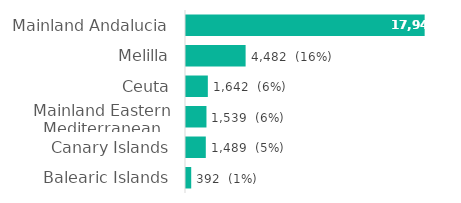
| Category | Series 0 |
|---|---|
| Mainland Andalucia | 17944 |
| Melilla | 4482 |
| Ceuta | 1642 |
| Mainland Eastern Mediterranean | 1539 |
| Canary Islands | 1489 |
| Balearic Islands | 392 |